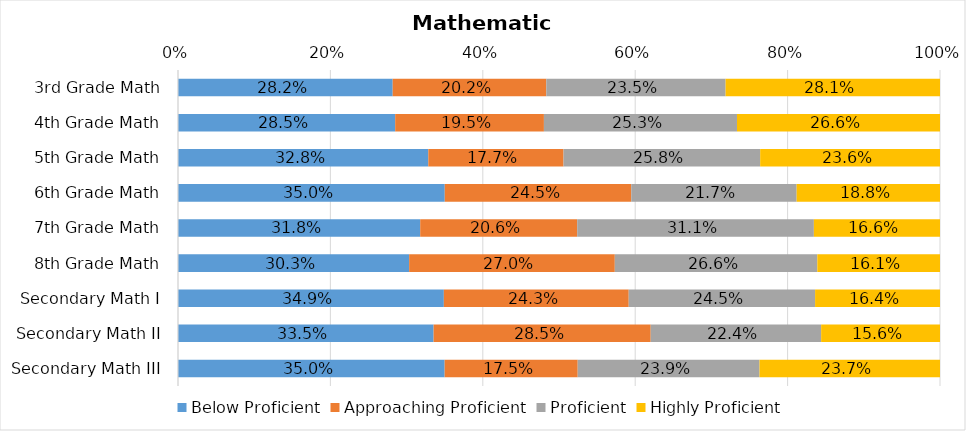
| Category | Below Proficient | Approaching Proficient | Proficient | Highly Proficient |
|---|---|---|---|---|
| 3rd Grade Math | 0.282 | 0.202 | 0.235 | 0.281 |
| 4th Grade Math | 0.285 | 0.195 | 0.253 | 0.266 |
| 5th Grade Math | 0.328 | 0.177 | 0.258 | 0.236 |
| 6th Grade Math | 0.35 | 0.245 | 0.217 | 0.188 |
| 7th Grade Math | 0.318 | 0.206 | 0.311 | 0.166 |
| 8th Grade Math | 0.303 | 0.27 | 0.266 | 0.161 |
| Secondary Math I | 0.349 | 0.243 | 0.245 | 0.164 |
| Secondary Math II | 0.335 | 0.285 | 0.224 | 0.156 |
| Secondary Math III | 0.35 | 0.175 | 0.239 | 0.237 |